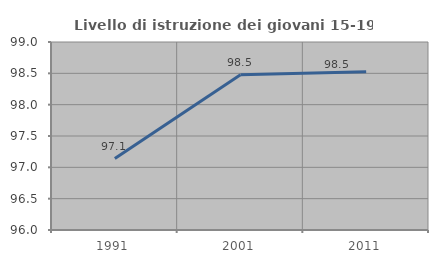
| Category | Livello di istruzione dei giovani 15-19 anni |
|---|---|
| 1991.0 | 97.14 |
| 2001.0 | 98.476 |
| 2011.0 | 98.523 |